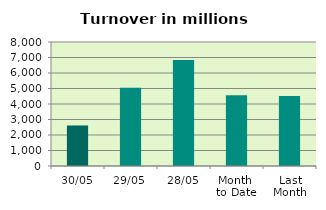
| Category | Series 0 |
|---|---|
| 30/05 | 2614.987 |
| 29/05 | 5042.605 |
| 28/05 | 6841.669 |
| Month 
to Date | 4569.913 |
| Last
Month | 4514.737 |